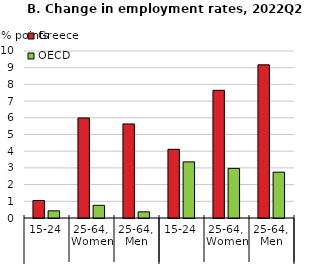
| Category | Greece | OECD |
|---|---|---|
| 0 | 1.049 | 0.429 |
| 1 | 5.99 | 0.76 |
| 2 | 5.633 | 0.368 |
| 3 | 4.112 | 3.36 |
| 4 | 7.646 | 2.971 |
| 5 | 9.173 | 2.744 |